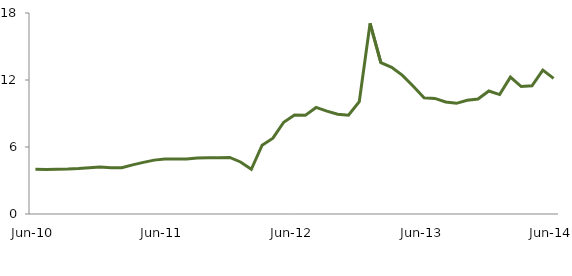
| Category | Series 0 |
|---|---|
| Jun-10 | 4.016 |
|  | 3.995 |
|  | 4.018 |
|  | 4.03 |
|  | 4.066 |
|  | 4.15 |
|  | 4.216 |
|  | 4.15 |
|  | 4.148 |
|  | 4.401 |
|  | 4.623 |
|  | 4.825 |
| Jun-11 | 4.918 |
|  | 4.919 |
|  | 4.926 |
|  | 5.012 |
|  | 5.043 |
|  | 5.038 |
|  | 5.067 |
|  | 4.66 |
|  | 4 |
|  | 6.158 |
|  | 6.787 |
|  | 8.219 |
| Jun-12 | 8.867 |
|  | 8.834 |
|  | 9.545 |
|  | 9.213 |
|  | 8.941 |
|  | 8.846 |
|  | 10.067 |
|  | 17.068 |
|  | 13.56 |
|  | 13.131 |
|  | 12.412 |
|  | 11.434 |
| Jun-13 | 10.414 |
|  | 10.35 |
|  | 10.032 |
|  | 9.912 |
|  | 10.18 |
|  | 10.298 |
|  | 11.017 |
|  | 10.695 |
|  | 12.26 |
|  | 11.417 |
|  | 11.48 |
|  | 12.892 |
| Jun-14 | 12.148 |